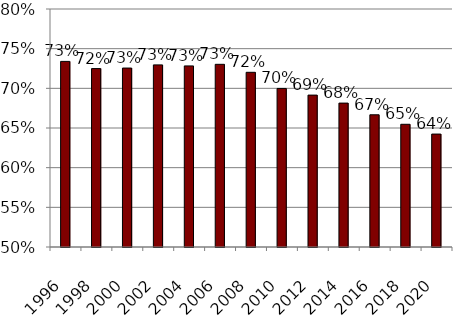
| Category | Series 0 |
|---|---|
| 1996.0 | 0.734 |
| 1998.0 | 0.725 |
| 2000.0 | 0.726 |
| 2002.0 | 0.73 |
| 2004.0 | 0.728 |
| 2006.0 | 0.73 |
| 2008.0 | 0.72 |
| 2010.0 | 0.7 |
| 2012.0 | 0.691 |
| 2014.0 | 0.681 |
| 2016.0 | 0.667 |
| 2018.0 | 0.655 |
| 2020.0 | 0.642 |